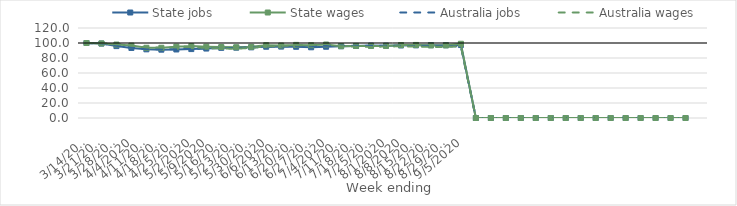
| Category | State jobs | State wages | Australia jobs | Australia wages |
|---|---|---|---|---|
| 14/03/2020 | 100 | 100 | 100 | 100 |
| 21/03/2020 | 99.209 | 99.442 | 99.287 | 99.672 |
| 28/03/2020 | 95.868 | 97.926 | 96.324 | 98.416 |
| 04/04/2020 | 93.38 | 96.542 | 93.668 | 96.718 |
| 11/04/2020 | 91.553 | 93.626 | 91.934 | 94.131 |
| 18/04/2020 | 91.091 | 93.644 | 91.469 | 94.023 |
| 25/04/2020 | 91.354 | 95.159 | 91.796 | 94.249 |
| 02/05/2020 | 91.89 | 95.836 | 92.192 | 94.719 |
| 09/05/2020 | 92.597 | 95.088 | 92.74 | 93.349 |
| 16/05/2020 | 93.537 | 94.634 | 93.27 | 92.686 |
| 23/05/2020 | 93.758 | 94.316 | 93.57 | 92.302 |
| 30/05/2020 | 94.229 | 94.86 | 94.082 | 93.6 |
| 06/06/2020 | 95.009 | 97.112 | 94.995 | 95.373 |
| 13/06/2020 | 95.212 | 96.658 | 95.458 | 96.064 |
| 20/06/2020 | 94.931 | 97.488 | 95.654 | 96.971 |
| 27/06/2020 | 94.286 | 97.002 | 95.59 | 97.092 |
| 04/07/2020 | 94.988 | 97.973 | 96.269 | 98.79 |
| 11/07/2020 | 95.666 | 95.827 | 96.518 | 95.694 |
| 18/07/2020 | 96.069 | 96.117 | 96.375 | 95.102 |
| 25/07/2020 | 96.56 | 96.07 | 96.44 | 94.758 |
| 01/08/2020 | 96.471 | 96.116 | 96.466 | 95.35 |
| 08/08/2020 | 96.672 | 97.291 | 96.196 | 95.604 |
| 15/08/2020 | 96.865 | 97.42 | 96.048 | 95.29 |
| 22/08/2020 | 97.096 | 96.787 | 95.872 | 94.881 |
| 29/08/2020 | 96.998 | 96.843 | 95.598 | 94.692 |
| 05/09/2020 | 97.268 | 98.988 | 95.533 | 95.73 |